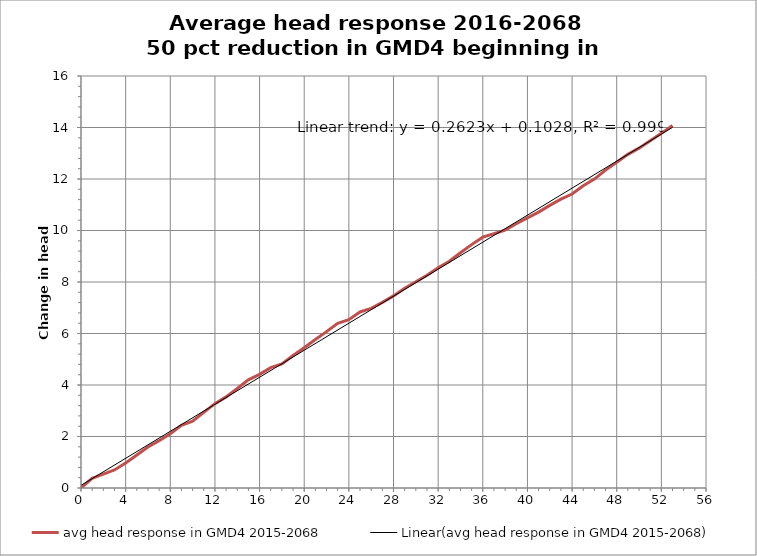
| Category | avg head response in GMD4 2015-2068 |
|---|---|
| 0.0 | 0 |
| 1.0 | 0.378 |
| 2.0 | 0.541 |
| 3.0 | 0.699 |
| 4.0 | 0.969 |
| 5.0 | 1.28 |
| 6.0 | 1.593 |
| 7.0 | 1.838 |
| 8.0 | 2.104 |
| 9.0 | 2.435 |
| 10.0 | 2.591 |
| 11.0 | 2.935 |
| 12.0 | 3.277 |
| 13.0 | 3.537 |
| 14.0 | 3.862 |
| 15.0 | 4.203 |
| 16.0 | 4.415 |
| 17.0 | 4.675 |
| 18.0 | 4.82 |
| 19.0 | 5.145 |
| 20.0 | 5.447 |
| 21.0 | 5.77 |
| 22.0 | 6.073 |
| 23.0 | 6.394 |
| 24.0 | 6.534 |
| 25.0 | 6.837 |
| 26.0 | 6.976 |
| 27.0 | 7.208 |
| 28.0 | 7.461 |
| 29.0 | 7.758 |
| 30.0 | 8.011 |
| 31.0 | 8.262 |
| 32.0 | 8.555 |
| 33.0 | 8.805 |
| 34.0 | 9.135 |
| 35.0 | 9.452 |
| 36.0 | 9.742 |
| 37.0 | 9.876 |
| 38.0 | 10.015 |
| 39.0 | 10.261 |
| 40.0 | 10.491 |
| 41.0 | 10.715 |
| 42.0 | 10.974 |
| 43.0 | 11.22 |
| 44.0 | 11.417 |
| 45.0 | 11.741 |
| 46.0 | 11.997 |
| 47.0 | 12.344 |
| 48.0 | 12.653 |
| 49.0 | 12.959 |
| 50.0 | 13.198 |
| 51.0 | 13.484 |
| 52.0 | 13.772 |
| 53.0 | 14.077 |